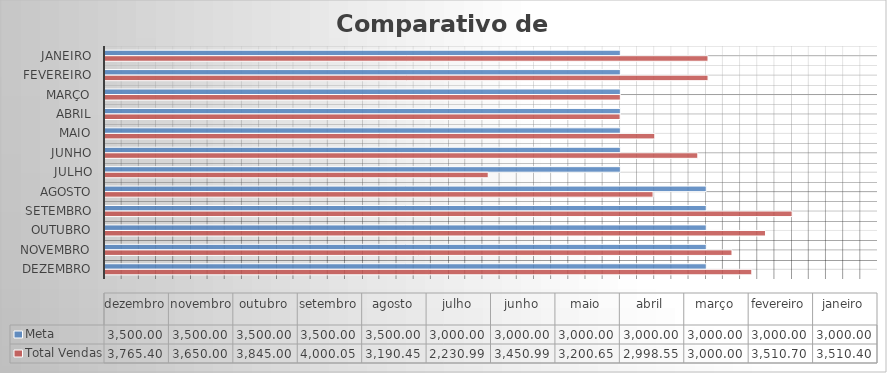
| Category | Meta | Total Vendas |
|---|---|---|
| janeiro | 3000 | 3510.4 |
| fevereiro | 3000 | 3510.7 |
| março | 3000 | 3000 |
| abril | 3000 | 2998.55 |
| maio | 3000 | 3200.65 |
| junho | 3000 | 3450.99 |
| julho | 3000 | 2230.99 |
| agosto | 3500 | 3190.45 |
| setembro | 3500 | 4000.05 |
| outubro | 3500 | 3845 |
| novembro | 3500 | 3650 |
| dezembro | 3500 | 3765.4 |